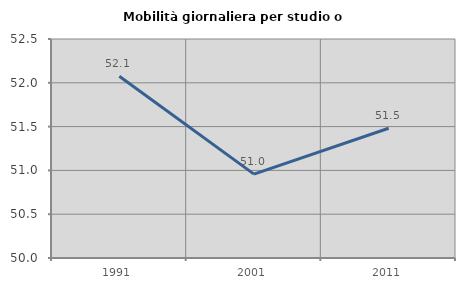
| Category | Mobilità giornaliera per studio o lavoro |
|---|---|
| 1991.0 | 52.075 |
| 2001.0 | 50.958 |
| 2011.0 | 51.481 |